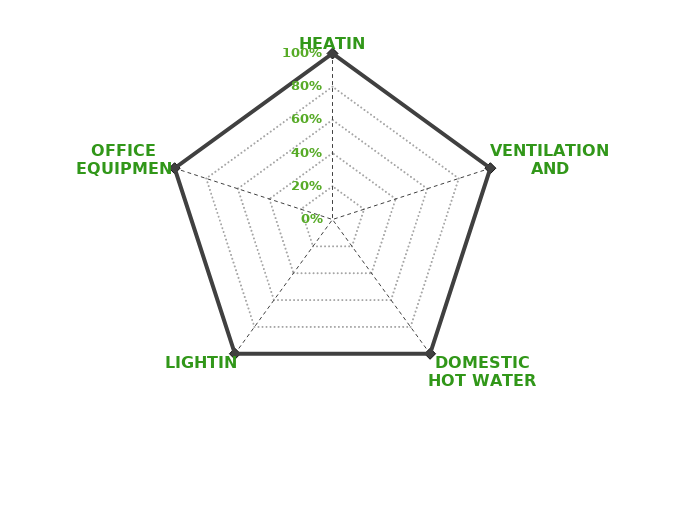
| Category | Series 0 |
|---|---|
| HEATING | 1 |
| VENTILATION AND COOLING | 1 |
| DOMESTIC HOT WATER | 1 |
| LIGHTING | 1 |
| OFFICE EQUIPMENT | 1 |